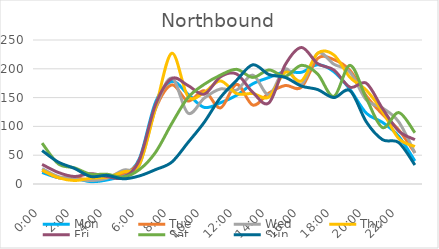
| Category | Mon | Tue | Wed | Thu | Fri | Sat | Sun |
|---|---|---|---|---|---|---|---|
| 0.0 | 20 | 24 | 27 | 24 | 34 | 71 | 58 |
| 0.041667 | 11 | 11 | 13 | 11 | 20 | 35 | 38 |
| 0.083333 | 10 | 11 | 9 | 6 | 13 | 28 | 27 |
| 0.125 | 4 | 7 | 6 | 10 | 18 | 17 | 13 |
| 0.166667 | 7 | 13 | 10 | 12 | 13 | 17 | 15 |
| 0.208333 | 16 | 18 | 24 | 21 | 11 | 12 | 9 |
| 0.25 | 44 | 41 | 33 | 34 | 42 | 25 | 14 |
| 0.291667 | 142 | 131 | 131 | 132 | 138 | 55 | 25 |
| 0.333333 | 178 | 172 | 184 | 227 | 183 | 105 | 38 |
| 0.375 | 156 | 144 | 123 | 152 | 171 | 150 | 72 |
| 0.416667 | 133 | 162 | 149 | 159 | 156 | 173 | 107 |
| 0.458333 | 141 | 132 | 165 | 179 | 186 | 189 | 150 |
| 0.5 | 154 | 173 | 163 | 157 | 191 | 199 | 180 |
| 0.541667 | 174 | 137 | 189 | 157 | 159 | 185 | 207 |
| 0.5833333333333334 | 185 | 158 | 155 | 151 | 141 | 198 | 190 |
| 0.625 | 195 | 171 | 200 | 194 | 207 | 187 | 185 |
| 0.666667 | 194 | 168 | 173 | 179 | 237 | 206 | 170 |
| 0.708333 | 207 | 218 | 227 | 227 | 209 | 191 | 164 |
| 0.75 | 195 | 216 | 208 | 224 | 198 | 152 | 150 |
| 0.791667 | 164 | 197 | 194 | 185 | 168 | 206 | 162 |
| 0.833333 | 123 | 153 | 146 | 163 | 175 | 149 | 108 |
| 0.875 | 107 | 121 | 132 | 126 | 131 | 98 | 77 |
| 0.916667 | 83 | 94 | 108 | 79 | 92 | 124 | 72 |
| 0.958333 | 40 | 54 | 54 | 65 | 77 | 89 | 33 |